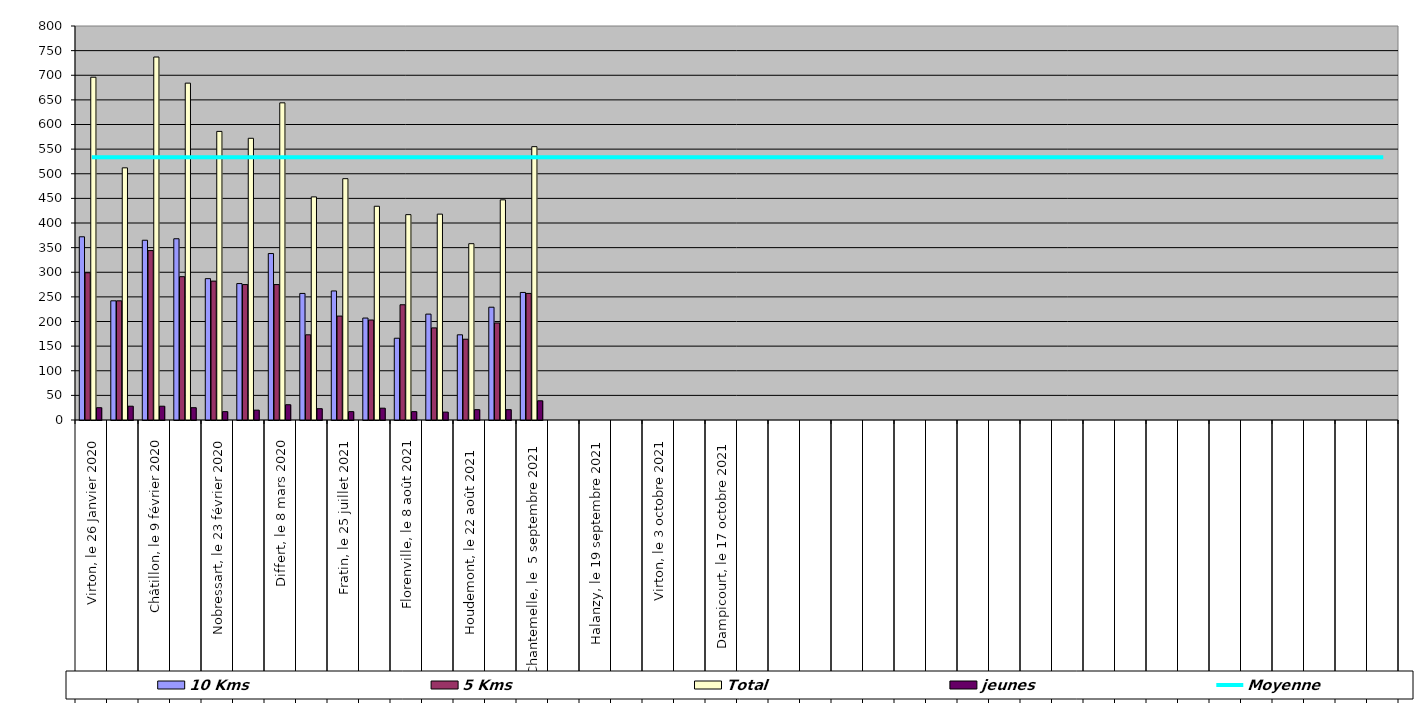
| Category | 10 Kms | 5 Kms | Total | jeunes |
|---|---|---|---|---|
| 0 | 372 | 299 | 696 | 25 |
| 1 | 242 | 242 | 512 | 28 |
| 2 | 365 | 344 | 737 | 28 |
| 3 | 368 | 291 | 684 | 25 |
| 4 | 287 | 282 | 586 | 17 |
| 5 | 277 | 275 | 572 | 20 |
| 6 | 338 | 275 | 644 | 31 |
| 7 | 257 | 173 | 453 | 23 |
| 8 | 262 | 211 | 490 | 17 |
| 9 | 207 | 203 | 434 | 24 |
| 10 | 166 | 234 | 417 | 17 |
| 11 | 215 | 187 | 418 | 16 |
| 12 | 173 | 164 | 358 | 21 |
| 13 | 229 | 197 | 447 | 21 |
| 14 | 259 | 257 | 555 | 39 |
| 15 | 0 | 0 | 0 | 0 |
| 16 | 0 | 0 | 0 | 0 |
| 17 | 0 | 0 | 0 | 0 |
| 18 | 0 | 0 | 0 | 0 |
| 19 | 0 | 0 | 0 | 0 |
| 20 | 0 | 0 | 0 | 0 |
| 21 | 0 | 0 | 0 | 0 |
| 22 | 0 | 0 | 0 | 0 |
| 23 | 0 | 0 | 0 | 0 |
| 24 | 0 | 0 | 0 | 0 |
| 25 | 0 | 0 | 0 | 0 |
| 26 | 0 | 0 | 0 | 0 |
| 27 | 0 | 0 | 0 | 0 |
| 28 | 0 | 0 | 0 | 0 |
| 29 | 0 | 0 | 0 | 0 |
| 30 | 0 | 0 | 0 | 0 |
| 31 | 0 | 0 | 0 | 0 |
| 32 | 0 | 0 | 0 | 0 |
| 33 | 0 | 0 | 0 | 0 |
| 34 | 0 | 0 | 0 | 0 |
| 35 | 0 | 0 | 0 | 0 |
| 36 | 0 | 0 | 0 | 0 |
| 37 | 0 | 0 | 0 | 0 |
| 38 | 0 | 0 | 0 | 0 |
| 39 | 0 | 0 | 0 | 0 |
| 40 | 0 | 0 | 0 | 0 |
| 41 | 0 | 0 | 0 | 0 |